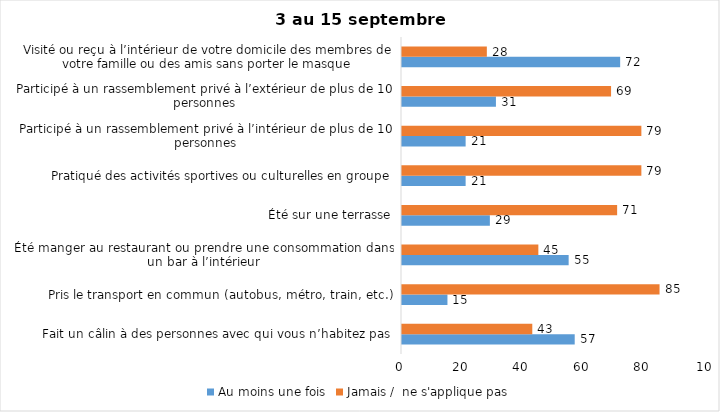
| Category | Au moins une fois | Jamais /  ne s'applique pas |
|---|---|---|
| Fait un câlin à des personnes avec qui vous n’habitez pas | 57 | 43 |
| Pris le transport en commun (autobus, métro, train, etc.) | 15 | 85 |
| Été manger au restaurant ou prendre une consommation dans un bar à l’intérieur | 55 | 45 |
| Été sur une terrasse | 29 | 71 |
| Pratiqué des activités sportives ou culturelles en groupe | 21 | 79 |
| Participé à un rassemblement privé à l’intérieur de plus de 10 personnes | 21 | 79 |
| Participé à un rassemblement privé à l’extérieur de plus de 10 personnes | 31 | 69 |
| Visité ou reçu à l’intérieur de votre domicile des membres de votre famille ou des amis sans porter le masque | 72 | 28 |